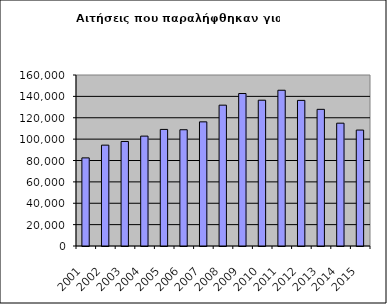
| Category | Series 0 |
|---|---|
| 2001.0 | 82454 |
| 2002.0 | 94358 |
| 2003.0 | 97793 |
| 2004.0 | 102813 |
| 2005.0 | 109089 |
| 2006.0 | 108785 |
| 2007.0 | 116159 |
| 2008.0 | 131779 |
| 2009.0 | 142663 |
| 2010.0 | 136417 |
| 2011.0 | 145734 |
| 2012.0 | 136250 |
| 2013.0 | 127876 |
| 2014.0 | 114913 |
| 2015.0 | 108465 |